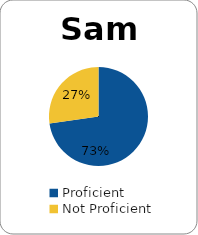
| Category | Series 0 |
|---|---|
| Proficient | 0.727 |
| Not Proficient | 0.273 |